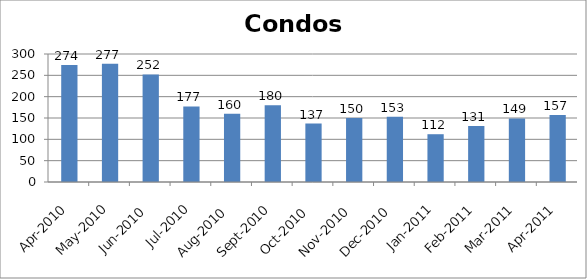
| Category | Series 0 |
|---|---|
| 2010-04-01 | 274 |
| 2010-05-01 | 277 |
| 2010-06-01 | 252 |
| 2010-07-01 | 177 |
| 2010-08-01 | 160 |
| 2010-09-01 | 180 |
| 2010-10-01 | 137 |
| 2010-11-01 | 150 |
| 2010-12-01 | 153 |
| 2011-01-01 | 112 |
| 2011-02-01 | 131 |
| 2011-03-01 | 149 |
| 2011-04-01 | 157 |